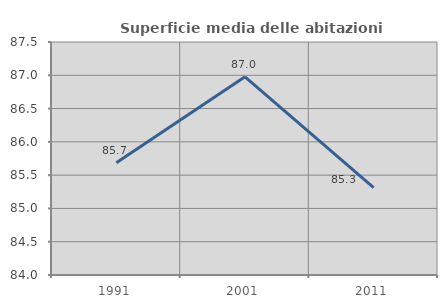
| Category | Superficie media delle abitazioni occupate |
|---|---|
| 1991.0 | 85.688 |
| 2001.0 | 86.976 |
| 2011.0 | 85.313 |